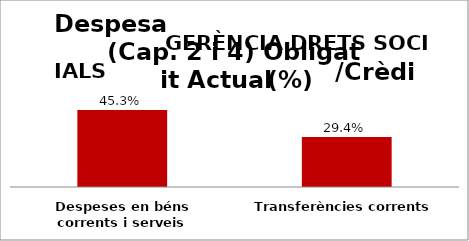
| Category | Series 0 |
|---|---|
| Despeses en béns corrents i serveis | 0.453 |
| Transferències corrents | 0.294 |